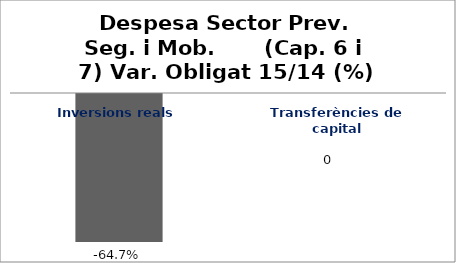
| Category | Series 0 |
|---|---|
| Inversions reals | -0.647 |
| Transferències de capital | 0 |